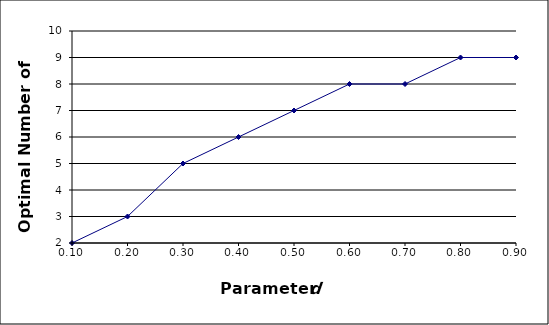
| Category | N* |
|---|---|
| 0.1 | 2 |
| 0.2 | 3 |
| 0.3 | 5 |
| 0.4 | 6 |
| 0.5 | 7 |
| 0.6 | 8 |
| 0.7 | 8 |
| 0.8 | 9 |
| 0.9 | 9 |